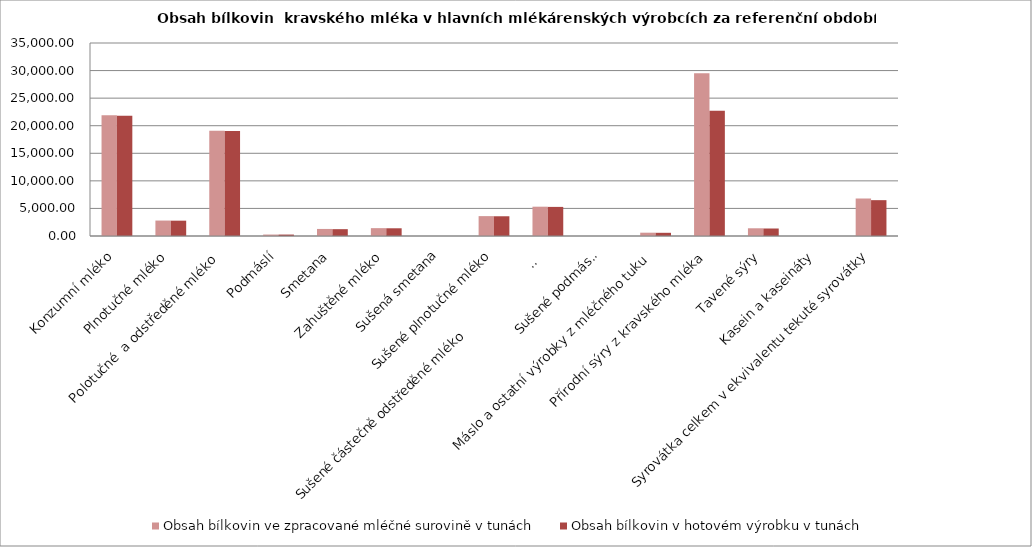
| Category | Obsah bílkovin ve zpracované mléčné surovině v tunách | Obsah bílkovin v hotovém výrobku v tunách |
|---|---|---|
| Konzumní mléko | 21903 | 21800 |
| Plnotučné mléko | 2800 | 2780 |
| Polotučné  a odstředěné mléko | 19090 | 19020 |
| Podmáslí | 264 | 260 |
| Smetana | 1280 | 1240 |
| Zahuštěné mléko | 1424 | 1400 |
| Sušená smetana | 0 | 0 |
| Sušené plnotučné mléko | 3605 | 3580 |
| Sušené částečně odstředěné mléko                                        a sušené odstředěné mléko | 5315 | 5278 |
| Sušené podmáslí | 0 | 0 |
| Máslo a ostatní výrobky z mléčného tuku | 600 | 580 |
| Přírodní sýry z kravského mléka | 29500 | 22700 |
| Tavené sýry | 1400 | 1360 |
| Kasein a kaseináty | 0 | 0 |
| Syrovátka celkem v ekvivalentu tekuté syrovátky | 6800 | 6500 |